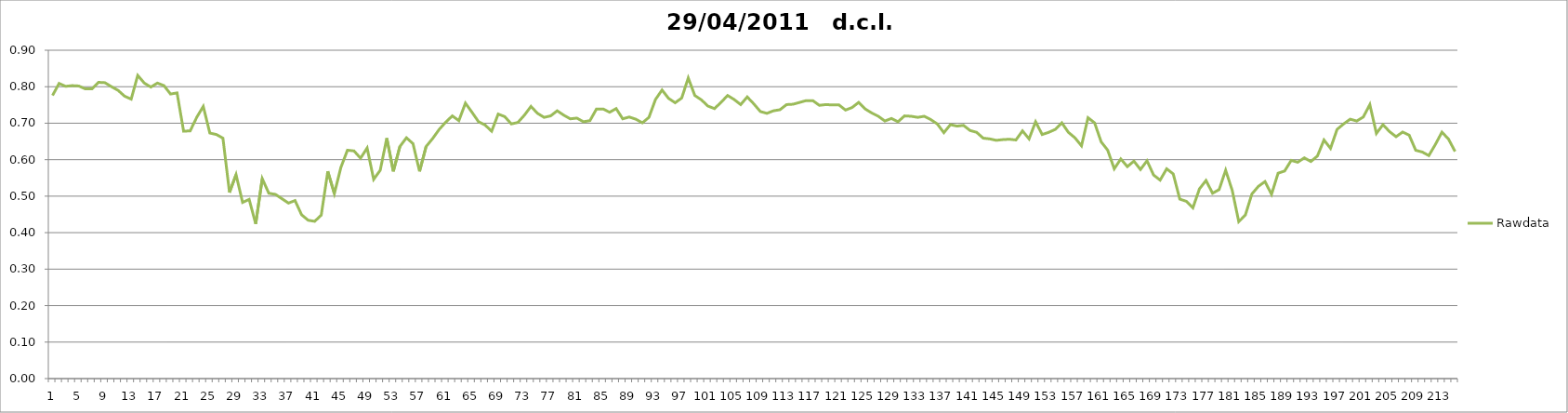
| Category | Rawdata |
|---|---|
| 0 | 0.776 |
| 1 | 0.809 |
| 2 | 0.801 |
| 3 | 0.803 |
| 4 | 0.802 |
| 5 | 0.794 |
| 6 | 0.794 |
| 7 | 0.812 |
| 8 | 0.811 |
| 9 | 0.8 |
| 10 | 0.79 |
| 11 | 0.774 |
| 12 | 0.766 |
| 13 | 0.831 |
| 14 | 0.81 |
| 15 | 0.799 |
| 16 | 0.81 |
| 17 | 0.803 |
| 18 | 0.78 |
| 19 | 0.783 |
| 20 | 0.678 |
| 21 | 0.679 |
| 22 | 0.716 |
| 23 | 0.746 |
| 24 | 0.673 |
| 25 | 0.669 |
| 26 | 0.659 |
| 27 | 0.51 |
| 28 | 0.559 |
| 29 | 0.483 |
| 30 | 0.491 |
| 31 | 0.424 |
| 32 | 0.548 |
| 33 | 0.508 |
| 34 | 0.505 |
| 35 | 0.493 |
| 36 | 0.481 |
| 37 | 0.488 |
| 38 | 0.449 |
| 39 | 0.434 |
| 40 | 0.431 |
| 41 | 0.448 |
| 42 | 0.568 |
| 43 | 0.507 |
| 44 | 0.579 |
| 45 | 0.626 |
| 46 | 0.624 |
| 47 | 0.604 |
| 48 | 0.632 |
| 49 | 0.546 |
| 50 | 0.571 |
| 51 | 0.659 |
| 52 | 0.568 |
| 53 | 0.636 |
| 54 | 0.66 |
| 55 | 0.644 |
| 56 | 0.568 |
| 57 | 0.636 |
| 58 | 0.658 |
| 59 | 0.683 |
| 60 | 0.703 |
| 61 | 0.72 |
| 62 | 0.707 |
| 63 | 0.755 |
| 64 | 0.73 |
| 65 | 0.704 |
| 66 | 0.695 |
| 67 | 0.678 |
| 68 | 0.725 |
| 69 | 0.718 |
| 70 | 0.698 |
| 71 | 0.702 |
| 72 | 0.722 |
| 73 | 0.746 |
| 74 | 0.727 |
| 75 | 0.716 |
| 76 | 0.72 |
| 77 | 0.734 |
| 78 | 0.722 |
| 79 | 0.712 |
| 80 | 0.714 |
| 81 | 0.704 |
| 82 | 0.707 |
| 83 | 0.739 |
| 84 | 0.739 |
| 85 | 0.73 |
| 86 | 0.74 |
| 87 | 0.712 |
| 88 | 0.717 |
| 89 | 0.711 |
| 90 | 0.701 |
| 91 | 0.716 |
| 92 | 0.765 |
| 93 | 0.791 |
| 94 | 0.768 |
| 95 | 0.756 |
| 96 | 0.769 |
| 97 | 0.824 |
| 98 | 0.776 |
| 99 | 0.764 |
| 100 | 0.747 |
| 101 | 0.74 |
| 102 | 0.757 |
| 103 | 0.776 |
| 104 | 0.765 |
| 105 | 0.751 |
| 106 | 0.772 |
| 107 | 0.753 |
| 108 | 0.732 |
| 109 | 0.727 |
| 110 | 0.734 |
| 111 | 0.737 |
| 112 | 0.751 |
| 113 | 0.752 |
| 114 | 0.757 |
| 115 | 0.762 |
| 116 | 0.762 |
| 117 | 0.749 |
| 118 | 0.751 |
| 119 | 0.75 |
| 120 | 0.75 |
| 121 | 0.736 |
| 122 | 0.743 |
| 123 | 0.757 |
| 124 | 0.739 |
| 125 | 0.728 |
| 126 | 0.719 |
| 127 | 0.706 |
| 128 | 0.713 |
| 129 | 0.704 |
| 130 | 0.72 |
| 131 | 0.719 |
| 132 | 0.716 |
| 133 | 0.719 |
| 134 | 0.71 |
| 135 | 0.698 |
| 136 | 0.674 |
| 137 | 0.696 |
| 138 | 0.692 |
| 139 | 0.694 |
| 140 | 0.68 |
| 141 | 0.675 |
| 142 | 0.659 |
| 143 | 0.657 |
| 144 | 0.653 |
| 145 | 0.655 |
| 146 | 0.656 |
| 147 | 0.654 |
| 148 | 0.679 |
| 149 | 0.657 |
| 150 | 0.704 |
| 151 | 0.669 |
| 152 | 0.675 |
| 153 | 0.683 |
| 154 | 0.701 |
| 155 | 0.675 |
| 156 | 0.66 |
| 157 | 0.638 |
| 158 | 0.715 |
| 159 | 0.701 |
| 160 | 0.649 |
| 161 | 0.626 |
| 162 | 0.575 |
| 163 | 0.602 |
| 164 | 0.581 |
| 165 | 0.596 |
| 166 | 0.573 |
| 167 | 0.597 |
| 168 | 0.558 |
| 169 | 0.544 |
| 170 | 0.575 |
| 171 | 0.561 |
| 172 | 0.492 |
| 173 | 0.486 |
| 174 | 0.468 |
| 175 | 0.52 |
| 176 | 0.543 |
| 177 | 0.508 |
| 178 | 0.518 |
| 179 | 0.571 |
| 180 | 0.516 |
| 181 | 0.43 |
| 182 | 0.448 |
| 183 | 0.506 |
| 184 | 0.527 |
| 185 | 0.54 |
| 186 | 0.505 |
| 187 | 0.563 |
| 188 | 0.569 |
| 189 | 0.598 |
| 190 | 0.593 |
| 191 | 0.605 |
| 192 | 0.595 |
| 193 | 0.61 |
| 194 | 0.654 |
| 195 | 0.631 |
| 196 | 0.683 |
| 197 | 0.698 |
| 198 | 0.711 |
| 199 | 0.706 |
| 200 | 0.717 |
| 201 | 0.751 |
| 202 | 0.672 |
| 203 | 0.696 |
| 204 | 0.677 |
| 205 | 0.663 |
| 206 | 0.676 |
| 207 | 0.667 |
| 208 | 0.626 |
| 209 | 0.621 |
| 210 | 0.611 |
| 211 | 0.642 |
| 212 | 0.676 |
| 213 | 0.656 |
| 214 | 0.622 |